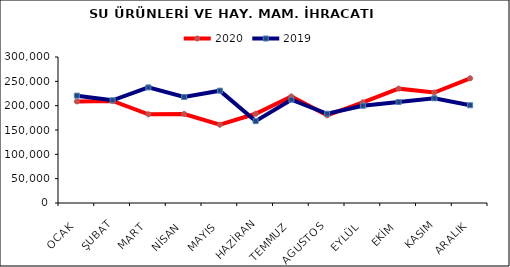
| Category | 2020 | 2019 |
|---|---|---|
| OCAK | 208704.155 | 220592.68 |
| ŞUBAT | 209590.385 | 211036.862 |
| MART | 182293.106 | 237540.302 |
| NİSAN | 182916.507 | 217806.064 |
| MAYIS | 160819.648 | 230803.278 |
| HAZİRAN | 183353.037 | 168264.721 |
| TEMMUZ | 219006.329 | 212236.433 |
| AGUSTOS | 180206.392 | 183383.61 |
| EYLÜL | 206822.23 | 199909.511 |
| EKİM | 234956.962 | 207439.251 |
| KASIM | 227002.424 | 215149.308 |
| ARALIK | 256259.894 | 200858.16 |